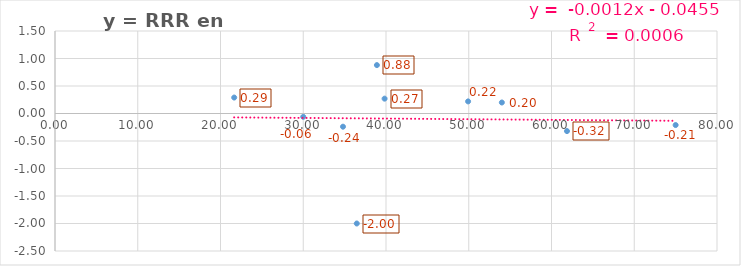
| Category | y = RRR en Mort |
|---|---|
| 38.9 | 0.88 |
| 39.8298530549111 | 0.27 |
| 54.0 | 0.2 |
| 61.8716163959784 | -0.32 |
| 21.6550657385924 | 0.29 |
| 75.0 | -0.21 |
| 36.4663451291327 | -2 |
| 34.8027842227378 | -0.24 |
| 30.0 | -0.06 |
| 49.92 | 0.22 |